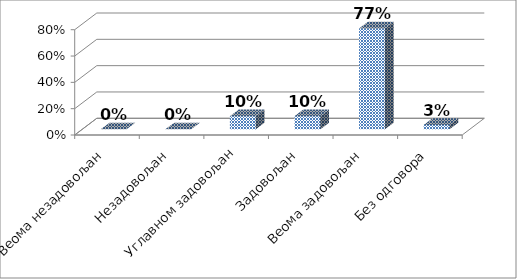
| Category | Series 0 |
|---|---|
| Веома незадовољан | 0 |
| Незадовољан | 0 |
| Углавном задовољан | 0.1 |
| Задовољан | 0.1 |
| Веома задовољан | 0.767 |
| Без одговора | 0.033 |